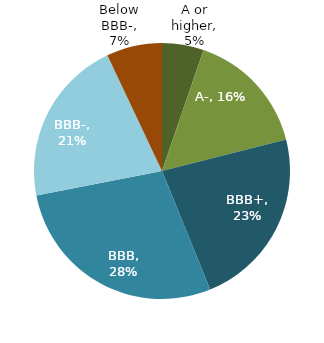
| Category | Series 0 |
|---|---|
| A or higher | 0.053 |
| A- | 0.158 |
| BBB+ | 0.228 |
| BBB | 0.281 |
| BBB- | 0.211 |
| Below BBB- | 0.07 |